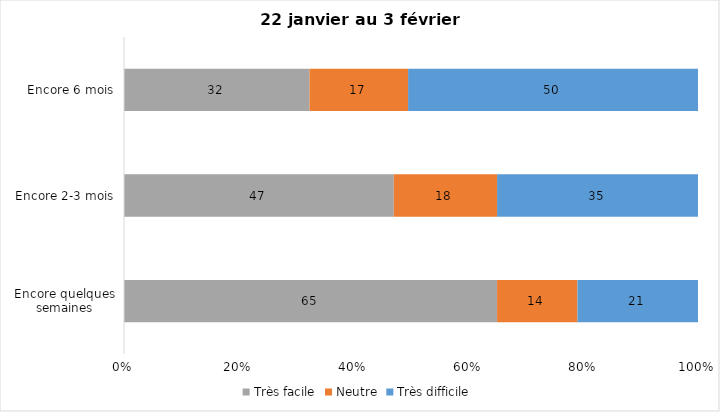
| Category | Très facile | Neutre | Très difficile |
|---|---|---|---|
| Encore quelques semaines | 65 | 14 | 21 |
| Encore 2-3 mois | 47 | 18 | 35 |
| Encore 6 mois | 32 | 17 | 50 |